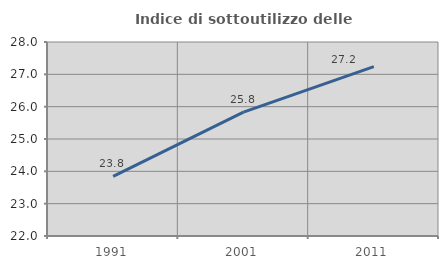
| Category | Indice di sottoutilizzo delle abitazioni  |
|---|---|
| 1991.0 | 23.846 |
| 2001.0 | 25.829 |
| 2011.0 | 27.239 |